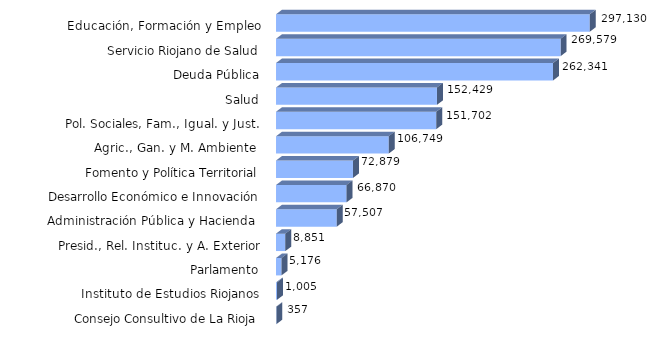
| Category | Series 0 |
|---|---|
| Consejo Consultivo de La Rioja | 357.06 |
| Instituto de Estudios Riojanos | 1004.52 |
| Parlamento | 5176.17 |
| Presid., Rel. Instituc. y A. Exterior | 8850.78 |
| Administración Pública y Hacienda  | 57506.81 |
| Desarrollo Económico e Innovación | 66869.82 |
| Fomento y Política Territorial | 72878.86 |
| Agric., Gan. y M. Ambiente  | 106749.46 |
| Pol. Sociales, Fam., Igual. y Just. | 151701.86 |
| Salud | 152429.42 |
| Deuda Pública | 262340.74 |
| Servicio Riojano de Salud | 269579.4 |
| Educación, Formación y Empleo | 297130.09 |